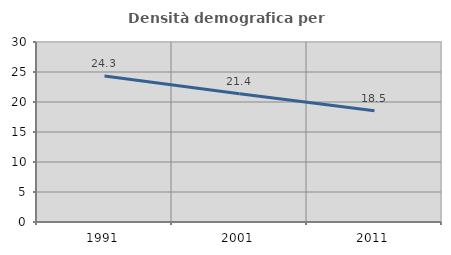
| Category | Densità demografica |
|---|---|
| 1991.0 | 24.33 |
| 2001.0 | 21.369 |
| 2011.0 | 18.537 |